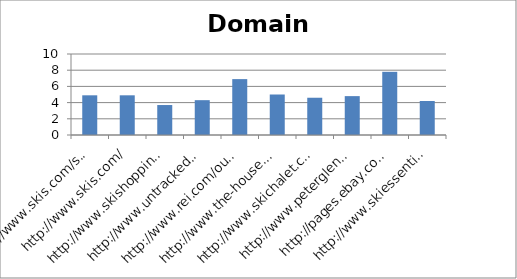
| Category | Domain mozTrust |
|---|---|
| http://www.skis.com/ski-equipment/c9/ | 4.9 |
| http://www.skis.com/ | 4.9 |
| http://www.skishoppingguide.com/ | 3.7 |
| http://www.untracked.com/ | 4.3 |
| http://www.rei.com/outlet/category/22000078 | 6.9 |
| http://www.the-house.com/skis.html | 5 |
| http://www.skichalet.com/ | 4.6 |
| http://www.peterglenn.com/ | 4.8 |
| http://pages.ebay.com/buy/guides/skis-skiing-equipment-buying-guide/ | 7.8 |
| http://www.skiessentials.com/ | 4.2 |